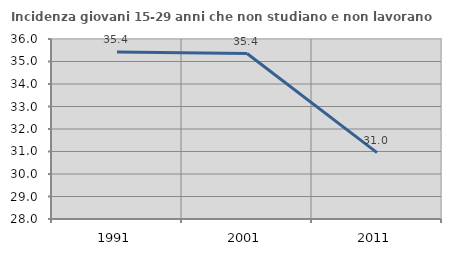
| Category | Incidenza giovani 15-29 anni che non studiano e non lavorano  |
|---|---|
| 1991.0 | 35.426 |
| 2001.0 | 35.354 |
| 2011.0 | 30.952 |